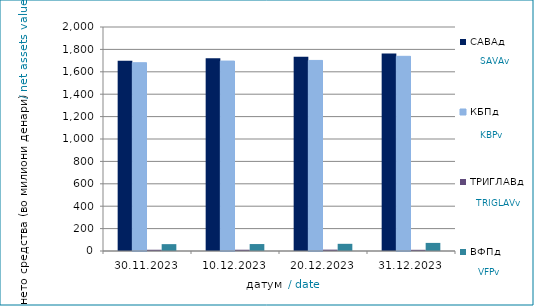
| Category | САВАд | КБПд | ТРИГЛАВд | ВФПд |
|---|---|---|---|---|
| 2023-11-30 | 1698.418 | 1680.974 | 11.224 | 61.274 |
| 2023-12-10 | 1719.897 | 1695.733 | 11.409 | 62.063 |
| 2023-12-20 | 1733.879 | 1701.547 | 12.252 | 64.076 |
| 2023-12-31 | 1763.844 | 1738.268 | 10.65 | 72.303 |